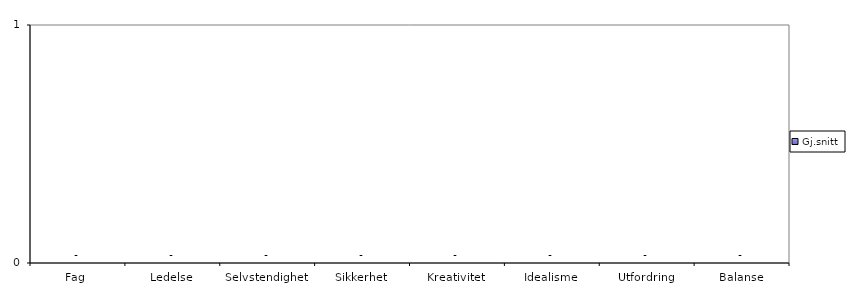
| Category | Gj.snitt |
|---|---|
| Fag | 0 |
| Ledelse | 0 |
| Selvstendighet | 0 |
| Sikkerhet | 0 |
| Kreativitet | 0 |
| Idealisme | 0 |
| Utfordring | 0 |
| Balanse | 0 |